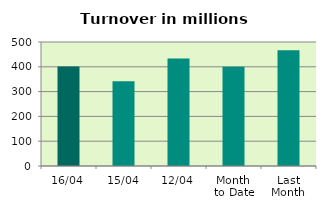
| Category | Series 0 |
|---|---|
| 16/04 | 400.997 |
| 15/04 | 341.625 |
| 12/04 | 433.786 |
| Month 
to Date | 400.699 |
| Last
Month | 466.511 |